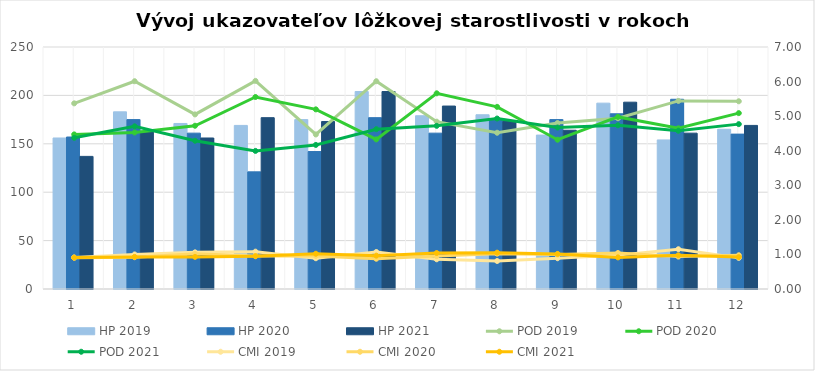
| Category | HP 2019 | HP 2020 | HP 2021 |
|---|---|---|---|
| 0 | 156 | 157 | 137 |
| 1 | 183 | 175 | 163 |
| 2 | 171 | 161 | 156 |
| 3 | 169 | 121 | 177 |
| 4 | 175 | 142 | 173 |
| 5 | 204 | 177 | 204 |
| 6 | 179 | 161 | 189 |
| 7 | 180 | 175 | 173 |
| 8 | 159 | 175 | 164 |
| 9 | 192 | 181 | 193 |
| 10 | 154 | 196 | 161 |
| 11 | 165 | 160 | 169 |